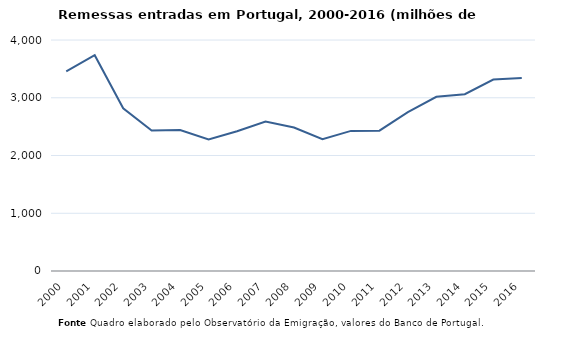
| Category | Entradas |
|---|---|
| 2000.0 | 3458.12 |
| 2001.0 | 3736.82 |
| 2002.0 | 2817.88 |
| 2003.0 | 2433.78 |
| 2004.0 | 2442.16 |
| 2005.0 | 2277.25 |
| 2006.0 | 2420.27 |
| 2007.0 | 2588.42 |
| 2008.0 | 2484.68 |
| 2009.0 | 2281.87 |
| 2010.0 | 2425.9 |
| 2011.0 | 2430.49 |
| 2012.0 | 2749.46 |
| 2013.0 | 3015.78 |
| 2014.0 | 3060.71 |
| 2015.0 | 3315.62 |
| 2016.0 | 3343.2 |